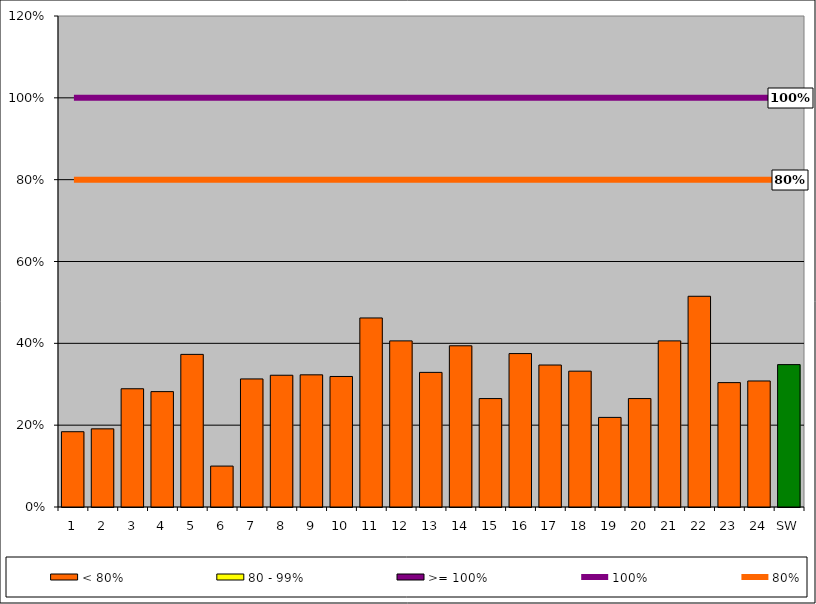
| Category | < 80% | 80 - 99% | >= 100% |
|---|---|---|---|
| 1 | 0.184 | 0 | 0 |
| 2 | 0.191 | 0 | 0 |
| 3 | 0.289 | 0 | 0 |
| 4 | 0.282 | 0 | 0 |
| 5 | 0.373 | 0 | 0 |
| 6 | 0.1 | 0 | 0 |
| 7 | 0.313 | 0 | 0 |
| 8 | 0.322 | 0 | 0 |
| 9 | 0.323 | 0 | 0 |
| 10 | 0.319 | 0 | 0 |
| 11 | 0.462 | 0 | 0 |
| 12 | 0.406 | 0 | 0 |
| 13 | 0.329 | 0 | 0 |
| 14 | 0.394 | 0 | 0 |
| 15 | 0.265 | 0 | 0 |
| 16 | 0.375 | 0 | 0 |
| 17 | 0.347 | 0 | 0 |
| 18 | 0.332 | 0 | 0 |
| 19 | 0.219 | 0 | 0 |
| 20 | 0.265 | 0 | 0 |
| 21 | 0.406 | 0 | 0 |
| 22 | 0.515 | 0 | 0 |
| 23 | 0.304 | 0 | 0 |
| 24 | 0.308 | 0 | 0 |
| SW | 0.348 | 0 | 0 |